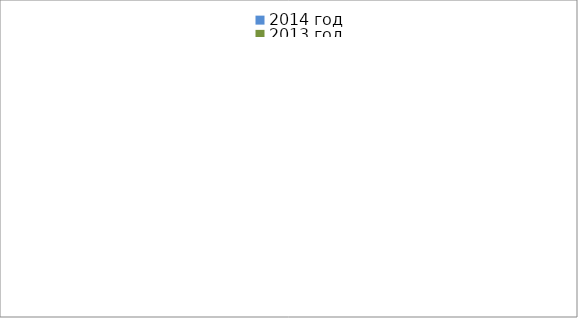
| Category | 2014 год | 2013 год |
|---|---|---|
|  - поджог | 25 | 35 |
|  - неосторожное обращение с огнём | 49 | 62 |
|  - НПТЭ электрооборудования | 20 | 22 |
|  - НПУ и Э печей | 78 | 60 |
|  - НПУ и Э транспортных средств | 65 | 57 |
|   -Шалость с огнем детей | 1 | 4 |
|  -НППБ при эксплуатации эл.приборов | 20 | 28 |
|  - курение | 21 | 12 |
| - прочие | 98 | 89 |
| - не установленные причины | 8 | 3 |